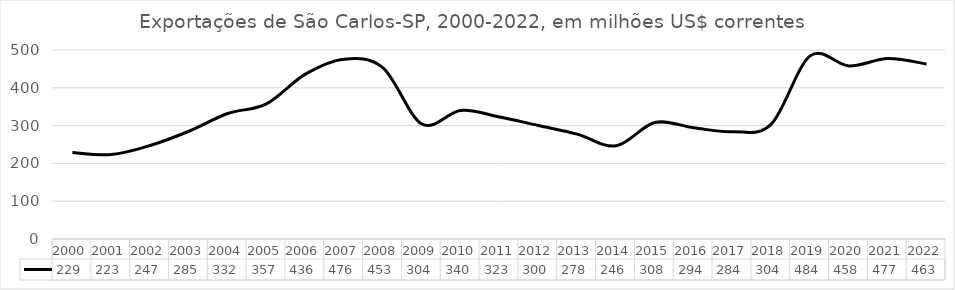
| Category | Series 0 |
|---|---|
| 2000.0 | 228.917 |
| 2001.0 | 223.372 |
| 2002.0 | 247.439 |
| 2003.0 | 285.073 |
| 2004.0 | 331.969 |
| 2005.0 | 357.458 |
| 2006.0 | 436.073 |
| 2007.0 | 475.796 |
| 2008.0 | 452.725 |
| 2009.0 | 304.207 |
| 2010.0 | 340.228 |
| 2011.0 | 322.91 |
| 2012.0 | 300.284 |
| 2013.0 | 277.52 |
| 2014.0 | 246.453 |
| 2015.0 | 308.052 |
| 2016.0 | 294.309 |
| 2017.0 | 283.692 |
| 2018.0 | 303.92 |
| 2019.0 | 484.472 |
| 2020.0 | 457.825 |
| 2021.0 | 477.207 |
| 2022.0 | 463.09 |